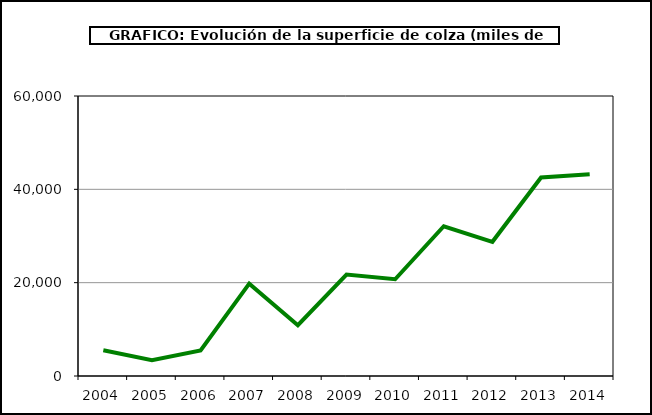
| Category | Superficie |
|---|---|
| 2004.0 | 5512 |
| 2005.0 | 3401 |
| 2006.0 | 5481 |
| 2007.0 | 19783 |
| 2008.0 | 10885 |
| 2009.0 | 21740 |
| 2010.0 | 20731 |
| 2011.0 | 32091 |
| 2012.0 | 28757 |
| 2013.0 | 42549 |
| 2014.0 | 43244 |